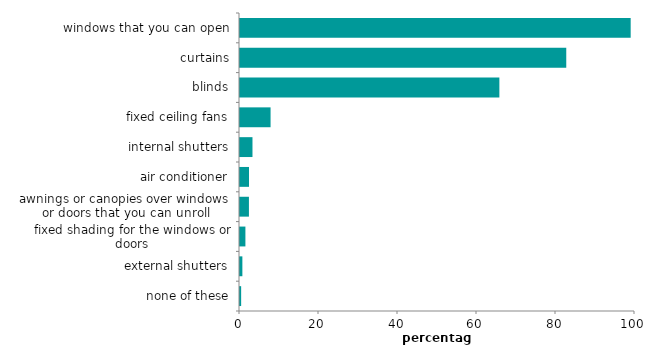
| Category | Series 0 |
|---|---|
| none of these | 0.289 |
| external shutters | 0.6 |
| fixed shading for the windows or doors | 1.369 |
| awnings or canopies over windows 
or doors that you can unroll | 2.26 |
| air conditioner | 2.281 |
| internal shutters | 3.159 |
| fixed ceiling fans | 7.74 |
| blinds | 65.664 |
| curtains | 82.597 |
| windows that you can open | 98.905 |